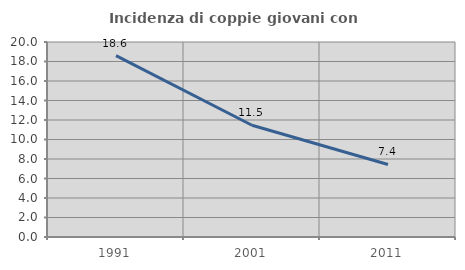
| Category | Incidenza di coppie giovani con figli |
|---|---|
| 1991.0 | 18.609 |
| 2001.0 | 11.46 |
| 2011.0 | 7.439 |